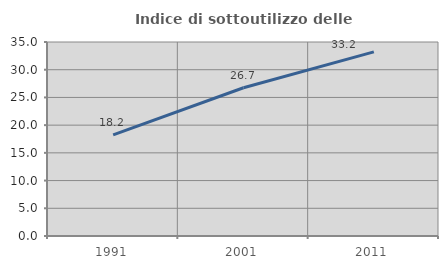
| Category | Indice di sottoutilizzo delle abitazioni  |
|---|---|
| 1991.0 | 18.247 |
| 2001.0 | 26.745 |
| 2011.0 | 33.22 |